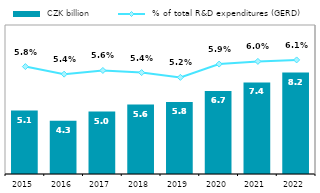
| Category |  CZK billion |
|---|---|
| 2015.0 | 5.112 |
| 2016.0 | 4.295 |
| 2017.0 | 5.024 |
| 2018.0 | 5.594 |
| 2019.0 | 5.791 |
| 2020.0 | 6.691 |
| 2021.0 | 7.372 |
| 2022.0 | 8.164 |